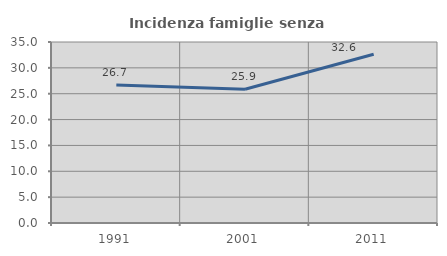
| Category | Incidenza famiglie senza nuclei |
|---|---|
| 1991.0 | 26.701 |
| 2001.0 | 25.864 |
| 2011.0 | 32.645 |